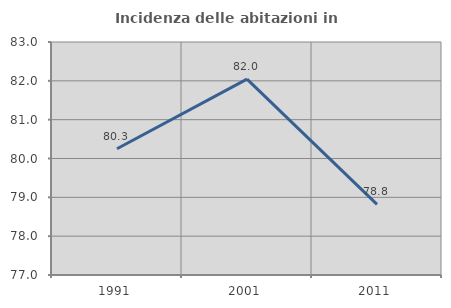
| Category | Incidenza delle abitazioni in proprietà  |
|---|---|
| 1991.0 | 80.25 |
| 2001.0 | 82.045 |
| 2011.0 | 78.818 |